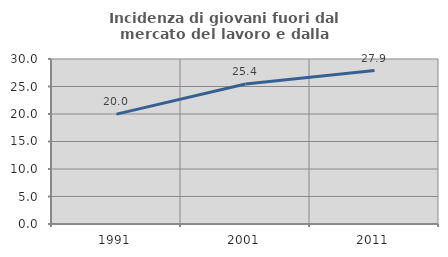
| Category | Incidenza di giovani fuori dal mercato del lavoro e dalla formazione  |
|---|---|
| 1991.0 | 19.971 |
| 2001.0 | 25.446 |
| 2011.0 | 27.904 |